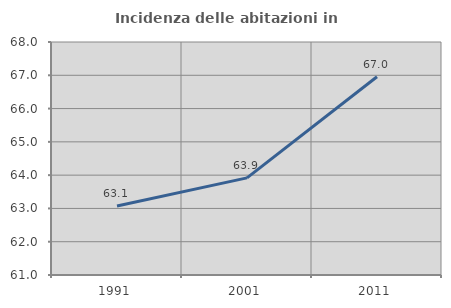
| Category | Incidenza delle abitazioni in proprietà  |
|---|---|
| 1991.0 | 63.074 |
| 2001.0 | 63.918 |
| 2011.0 | 66.955 |